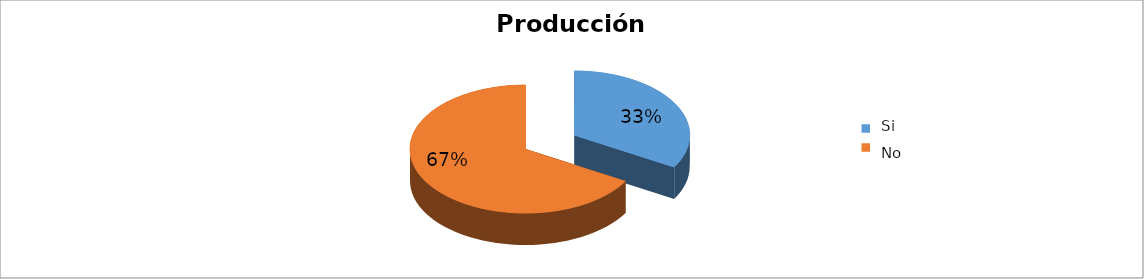
| Category | Series 0 |
|---|---|
| 0 | 0.333 |
| 1 | 0.667 |